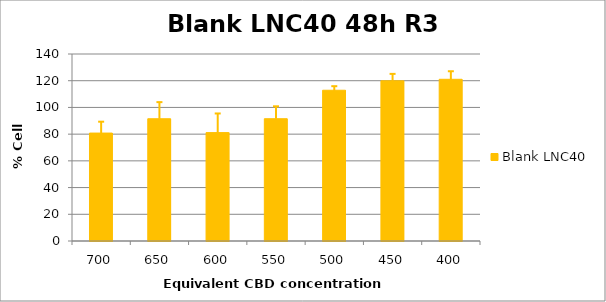
| Category | Blank LNC40 |
|---|---|
| 700.0 | 80.806 |
| 650.0 | 91.526 |
| 600.0 | 81.145 |
| 550.0 | 91.554 |
| 500.0 | 112.863 |
| 450.0 | 119.906 |
| 400.0 | 121.066 |